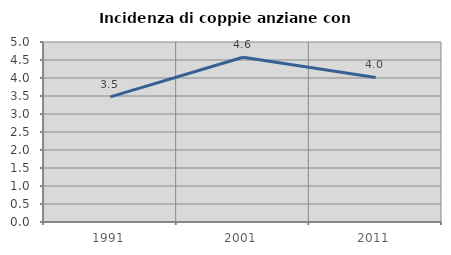
| Category | Incidenza di coppie anziane con figli |
|---|---|
| 1991.0 | 3.474 |
| 2001.0 | 4.577 |
| 2011.0 | 4.015 |